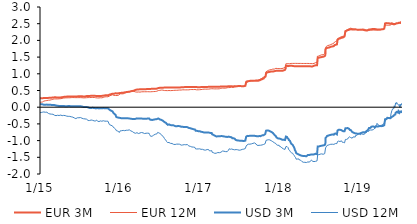
| Category | EUR 3M | EUR 12M | USD 3M | USD 12M |
|---|---|---|---|---|
| 2015-01-02 | 0.264 | 0.147 | 0.084 | -0.163 |
| 2015-01-05 | 0.265 | 0.149 | 0.086 | -0.164 |
| 2015-01-06 | 0.267 | 0.151 | 0.089 | -0.158 |
| 2015-01-07 | 0.27 | 0.151 | 0.088 | -0.157 |
| 2015-01-08 | 0.27 | 0.151 | 0.088 | -0.159 |
| 2015-01-09 | 0.27 | 0.152 | 0.086 | -0.156 |
| 2015-01-12 | 0.269 | 0.153 | 0.087 | -0.151 |
| 2015-01-13 | 0.259 | 0.152 | 0.077 | -0.152 |
| 2015-01-14 | 0.261 | 0.155 | 0.076 | -0.152 |
| 2015-01-15 | 0.261 | 0.157 | 0.077 | -0.145 |
| 2015-01-16 | 0.27 | 0.171 | 0.073 | -0.14 |
| 2015-01-19 | 0.274 | 0.181 | 0.074 | -0.142 |
| 2015-01-20 | 0.275 | 0.186 | 0.073 | -0.146 |
| 2015-01-21 | 0.275 | 0.187 | 0.073 | -0.152 |
| 2015-01-22 | 0.275 | 0.188 | 0.074 | -0.153 |
| 2015-01-23 | 0.275 | 0.188 | 0.074 | -0.153 |
| 2015-01-26 | 0.276 | 0.193 | 0.074 | -0.151 |
| 2015-01-27 | 0.275 | 0.193 | 0.077 | -0.152 |
| 2015-01-28 | 0.277 | 0.197 | 0.075 | -0.148 |
| 2015-01-29 | 0.278 | 0.199 | 0.075 | -0.15 |
| 2015-01-30 | 0.276 | 0.2 | 0.077 | -0.151 |
| 2015-02-02 | 0.275 | 0.199 | 0.078 | -0.149 |
| 2015-02-03 | 0.275 | 0.204 | 0.075 | -0.148 |
| 2015-02-04 | 0.275 | 0.207 | 0.075 | -0.155 |
| 2015-02-05 | 0.279 | 0.208 | 0.074 | -0.159 |
| 2015-02-06 | 0.277 | 0.209 | 0.074 | -0.161 |
| 2015-02-09 | 0.279 | 0.209 | 0.072 | -0.186 |
| 2015-02-10 | 0.28 | 0.208 | 0.072 | -0.194 |
| 2015-02-11 | 0.281 | 0.21 | 0.072 | -0.195 |
| 2015-02-12 | 0.282 | 0.21 | 0.072 | -0.202 |
| 2015-02-13 | 0.282 | 0.211 | 0.073 | -0.204 |
| 2015-02-16 | 0.282 | 0.212 | 0.074 | -0.203 |
| 2015-02-17 | 0.283 | 0.212 | 0.073 | -0.205 |
| 2015-02-18 | 0.282 | 0.215 | 0.069 | -0.214 |
| 2015-02-19 | 0.282 | 0.218 | 0.068 | -0.201 |
| 2015-02-20 | 0.282 | 0.22 | 0.067 | -0.204 |
| 2015-02-23 | 0.285 | 0.224 | 0.068 | -0.208 |
| 2015-02-24 | 0.286 | 0.225 | 0.069 | -0.207 |
| 2015-02-25 | 0.288 | 0.219 | 0.069 | -0.209 |
| 2015-02-26 | 0.29 | 0.222 | 0.068 | -0.209 |
| 2015-02-27 | 0.291 | 0.227 | 0.068 | -0.22 |
| 2015-03-02 | 0.291 | 0.24 | 0.069 | -0.212 |
| 2015-03-03 | 0.292 | 0.242 | 0.065 | -0.217 |
| 2015-03-04 | 0.292 | 0.243 | 0.066 | -0.219 |
| 2015-03-05 | 0.294 | 0.244 | 0.066 | -0.219 |
| 2015-03-06 | 0.294 | 0.245 | 0.065 | -0.218 |
| 2015-03-09 | 0.295 | 0.248 | 0.063 | -0.241 |
| 2015-03-10 | 0.298 | 0.251 | 0.062 | -0.241 |
| 2015-03-11 | 0.301 | 0.243 | 0.06 | -0.255 |
| 2015-03-12 | 0.303 | 0.245 | 0.059 | -0.254 |
| 2015-03-13 | 0.305 | 0.246 | 0.059 | -0.253 |
| 2015-03-16 | 0.295 | 0.248 | 0.05 | -0.253 |
| 2015-03-17 | 0.295 | 0.251 | 0.051 | -0.253 |
| 2015-03-18 | 0.285 | 0.238 | 0.04 | -0.265 |
| 2015-03-19 | 0.286 | 0.241 | 0.045 | -0.237 |
| 2015-03-20 | 0.289 | 0.245 | 0.043 | -0.247 |
| 2015-03-23 | 0.288 | 0.247 | 0.043 | -0.241 |
| 2015-03-24 | 0.289 | 0.248 | 0.041 | -0.242 |
| 2015-03-25 | 0.289 | 0.249 | 0.041 | -0.247 |
| 2015-03-26 | 0.289 | 0.249 | 0.037 | -0.25 |
| 2015-03-27 | 0.289 | 0.251 | 0.035 | -0.252 |
| 2015-03-30 | 0.292 | 0.252 | 0.036 | -0.249 |
| 2015-03-31 | 0.291 | 0.252 | 0.039 | -0.244 |
| 2015-04-01 | 0.292 | 0.254 | 0.039 | -0.248 |
| 2015-04-02 | 0.292 | 0.255 | 0.036 | -0.242 |
| 2015-04-03 | 0.292 | 0.255 | 0.036 | -0.242 |
| 2015-04-07 | 0.294 | 0.255 | 0.036 | -0.236 |
| 2015-04-08 | 0.296 | 0.259 | 0.039 | -0.239 |
| 2015-04-09 | 0.298 | 0.26 | 0.034 | -0.244 |
| 2015-04-10 | 0.298 | 0.262 | 0.033 | -0.248 |
| 2015-04-13 | 0.299 | 0.263 | 0.035 | -0.253 |
| 2015-04-14 | 0.302 | 0.267 | 0.034 | -0.25 |
| 2015-04-15 | 0.306 | 0.27 | 0.036 | -0.243 |
| 2015-04-16 | 0.308 | 0.272 | 0.035 | -0.241 |
| 2015-04-17 | 0.309 | 0.273 | 0.034 | -0.235 |
| 2015-04-20 | 0.309 | 0.274 | 0.034 | -0.245 |
| 2015-04-21 | 0.311 | 0.264 | 0.033 | -0.261 |
| 2015-04-22 | 0.312 | 0.275 | 0.032 | -0.249 |
| 2015-04-23 | 0.312 | 0.277 | 0.033 | -0.256 |
| 2015-04-24 | 0.311 | 0.278 | 0.033 | -0.256 |
| 2015-04-27 | 0.312 | 0.279 | 0.031 | -0.251 |
| 2015-04-28 | 0.315 | 0.282 | 0.032 | -0.246 |
| 2015-04-29 | 0.315 | 0.283 | 0.032 | -0.249 |
| 2015-04-30 | 0.315 | 0.279 | 0.031 | -0.255 |
| 2015-05-04 | 0.317 | 0.28 | 0.03 | -0.268 |
| 2015-05-05 | 0.318 | 0.283 | 0.03 | -0.268 |
| 2015-05-06 | 0.318 | 0.281 | 0.034 | -0.284 |
| 2015-05-07 | 0.319 | 0.281 | 0.031 | -0.286 |
| 2015-05-11 | 0.319 | 0.282 | 0.033 | -0.274 |
| 2015-05-12 | 0.319 | 0.281 | 0.035 | -0.285 |
| 2015-05-13 | 0.319 | 0.281 | 0.036 | -0.28 |
| 2015-05-14 | 0.319 | 0.282 | 0.034 | -0.273 |
| 2015-05-15 | 0.32 | 0.283 | 0.033 | -0.273 |
| 2015-05-18 | 0.321 | 0.282 | 0.034 | -0.275 |
| 2015-05-19 | 0.322 | 0.286 | 0.029 | -0.278 |
| 2015-05-20 | 0.322 | 0.288 | 0.027 | -0.289 |
| 2015-05-21 | 0.322 | 0.288 | 0.028 | -0.289 |
| 2015-05-22 | 0.322 | 0.288 | 0.026 | -0.288 |
| 2015-05-25 | 0.322 | 0.287 | 0.026 | -0.288 |
| 2015-05-26 | 0.323 | 0.289 | 0.024 | -0.307 |
| 2015-05-27 | 0.323 | 0.29 | 0.027 | -0.303 |
| 2015-05-28 | 0.323 | 0.291 | 0.027 | -0.303 |
| 2015-05-29 | 0.322 | 0.29 | 0.026 | -0.3 |
| 2015-06-01 | 0.323 | 0.289 | 0.028 | -0.298 |
| 2015-06-02 | 0.323 | 0.292 | 0.031 | -0.3 |
| 2015-06-03 | 0.324 | 0.29 | 0.031 | -0.295 |
| 2015-06-04 | 0.323 | 0.298 | 0.031 | -0.288 |
| 2015-06-05 | 0.323 | 0.299 | 0.029 | -0.289 |
| 2015-06-08 | 0.323 | 0.287 | 0.028 | -0.322 |
| 2015-06-09 | 0.323 | 0.297 | 0.025 | -0.308 |
| 2015-06-10 | 0.324 | 0.284 | 0.022 | -0.332 |
| 2015-06-11 | 0.324 | 0.289 | 0.024 | -0.338 |
| 2015-06-12 | 0.324 | 0.287 | 0.024 | -0.341 |
| 2015-06-15 | 0.324 | 0.286 | 0.027 | -0.342 |
| 2015-06-16 | 0.324 | 0.284 | 0.024 | -0.34 |
| 2015-06-17 | 0.324 | 0.284 | 0.024 | -0.341 |
| 2015-06-18 | 0.324 | 0.284 | 0.029 | -0.316 |
| 2015-06-19 | 0.324 | 0.284 | 0.029 | -0.317 |
| 2015-06-22 | 0.324 | 0.286 | 0.028 | -0.316 |
| 2015-06-23 | 0.324 | 0.287 | 0.029 | -0.319 |
| 2015-06-24 | 0.324 | 0.287 | 0.029 | -0.326 |
| 2015-06-25 | 0.325 | 0.288 | 0.028 | -0.324 |
| 2015-06-26 | 0.325 | 0.288 | 0.028 | -0.326 |
| 2015-06-29 | 0.326 | 0.287 | 0.026 | -0.316 |
| 2015-06-30 | 0.324 | 0.286 | 0.027 | -0.321 |
| 2015-07-01 | 0.324 | 0.286 | 0.026 | -0.328 |
| 2015-07-02 | 0.325 | 0.287 | 0.027 | -0.337 |
| 2015-07-03 | 0.325 | 0.287 | 0.026 | -0.322 |
| 2015-07-07 | 0.328 | 0.286 | 0.027 | -0.31 |
| 2015-07-08 | 0.328 | 0.286 | 0.027 | -0.3 |
| 2015-07-09 | 0.328 | 0.287 | 0.024 | -0.303 |
| 2015-07-10 | 0.328 | 0.286 | 0.024 | -0.313 |
| 2015-07-13 | 0.329 | 0.284 | 0.021 | -0.331 |
| 2015-07-14 | 0.329 | 0.282 | 0.022 | -0.329 |
| 2015-07-15 | 0.319 | 0.281 | 0.012 | -0.323 |
| 2015-07-16 | 0.319 | 0.281 | 0.013 | -0.323 |
| 2015-07-17 | 0.319 | 0.28 | 0.008 | -0.326 |
| 2015-07-20 | 0.319 | 0.279 | 0.005 | -0.345 |
| 2015-07-21 | 0.319 | 0.28 | 0.006 | -0.355 |
| 2015-07-22 | 0.329 | 0.279 | 0.018 | -0.355 |
| 2015-07-23 | 0.329 | 0.279 | 0.015 | -0.357 |
| 2015-07-24 | 0.319 | 0.28 | 0.006 | -0.357 |
| 2015-07-27 | 0.32 | 0.281 | 0.006 | -0.351 |
| 2015-07-28 | 0.321 | 0.281 | 0.003 | -0.354 |
| 2015-07-29 | 0.322 | 0.281 | 0.003 | -0.351 |
| 2015-07-30 | 0.323 | 0.281 | 0 | -0.364 |
| 2015-07-31 | 0.333 | 0.283 | 0.001 | -0.378 |
| 2015-08-03 | 0.333 | 0.284 | 0.006 | -0.359 |
| 2015-08-04 | 0.333 | 0.286 | 0.009 | -0.355 |
| 2015-08-05 | 0.334 | 0.287 | -0.001 | -0.382 |
| 2015-08-06 | 0.334 | 0.287 | -0.001 | -0.385 |
| 2015-08-07 | 0.334 | 0.287 | -0.002 | -0.386 |
| 2015-08-10 | 0.334 | 0.288 | -0.004 | -0.397 |
| 2015-08-11 | 0.334 | 0.288 | -0.004 | -0.389 |
| 2015-08-12 | 0.334 | 0.289 | 0.001 | -0.372 |
| 2015-08-13 | 0.334 | 0.289 | -0.011 | -0.385 |
| 2015-08-14 | 0.335 | 0.289 | -0.014 | -0.394 |
| 2015-08-17 | 0.337 | 0.289 | -0.023 | -0.399 |
| 2015-08-18 | 0.338 | 0.291 | -0.023 | -0.394 |
| 2015-08-19 | 0.339 | 0.29 | -0.023 | -0.4 |
| 2015-08-20 | 0.34 | 0.291 | -0.019 | -0.408 |
| 2015-08-21 | 0.341 | 0.29 | -0.019 | -0.398 |
| 2015-08-24 | 0.342 | 0.29 | -0.022 | -0.383 |
| 2015-08-25 | 0.343 | 0.289 | -0.017 | -0.377 |
| 2015-08-26 | 0.343 | 0.29 | -0.015 | -0.381 |
| 2015-08-27 | 0.343 | 0.29 | -0.014 | -0.392 |
| 2015-08-28 | 0.343 | 0.289 | -0.019 | -0.393 |
| 2015-08-31 | 0.343 | 0.29 | -0.019 | -0.393 |
| 2015-09-01 | 0.343 | 0.289 | -0.024 | -0.406 |
| 2015-09-02 | 0.343 | 0.29 | -0.023 | -0.404 |
| 2015-09-03 | 0.343 | 0.289 | -0.024 | -0.404 |
| 2015-09-04 | 0.344 | 0.292 | -0.022 | -0.4 |
| 2015-09-07 | 0.344 | 0.292 | -0.023 | -0.41 |
| 2015-09-08 | 0.335 | 0.282 | -0.032 | -0.417 |
| 2015-09-09 | 0.335 | 0.282 | -0.033 | -0.415 |
| 2015-09-10 | 0.336 | 0.283 | -0.036 | -0.415 |
| 2015-09-11 | 0.338 | 0.283 | -0.037 | -0.416 |
| 2015-09-14 | 0.338 | 0.283 | -0.036 | -0.415 |
| 2015-09-15 | 0.336 | 0.285 | -0.034 | -0.415 |
| 2015-09-16 | 0.347 | 0.284 | -0.03 | -0.427 |
| 2015-09-17 | 0.347 | 0.284 | -0.035 | -0.431 |
| 2015-09-18 | 0.347 | 0.286 | -0.009 | -0.385 |
| 2015-09-21 | 0.338 | 0.278 | -0.026 | -0.409 |
| 2015-09-22 | 0.339 | 0.28 | -0.027 | -0.412 |
| 2015-09-23 | 0.339 | 0.283 | -0.026 | -0.416 |
| 2015-09-24 | 0.34 | 0.282 | -0.026 | -0.417 |
| 2015-09-25 | 0.331 | 0.274 | -0.036 | -0.441 |
| 2015-09-29 | 0.331 | 0.277 | -0.036 | -0.432 |
| 2015-09-30 | 0.33 | 0.278 | -0.035 | -0.431 |
| 2015-10-01 | 0.333 | 0.28 | -0.034 | -0.427 |
| 2015-10-02 | 0.334 | 0.281 | -0.037 | -0.432 |
| 2015-10-05 | 0.336 | 0.283 | -0.033 | -0.411 |
| 2015-10-06 | 0.336 | 0.281 | -0.028 | -0.416 |
| 2015-10-07 | 0.336 | 0.28 | -0.029 | -0.42 |
| 2015-10-08 | 0.338 | 0.281 | -0.03 | -0.421 |
| 2015-10-09 | 0.339 | 0.281 | -0.031 | -0.425 |
| 2015-10-12 | 0.339 | 0.281 | -0.031 | -0.42 |
| 2015-10-13 | 0.339 | 0.281 | -0.031 | -0.415 |
| 2015-10-14 | 0.339 | 0.283 | -0.027 | -0.409 |
| 2015-10-15 | 0.342 | 0.286 | -0.025 | -0.396 |
| 2015-10-16 | 0.341 | 0.291 | -0.027 | -0.406 |
| 2015-10-19 | 0.344 | 0.292 | -0.027 | -0.406 |
| 2015-10-20 | 0.343 | 0.291 | -0.03 | -0.408 |
| 2015-10-21 | 0.343 | 0.29 | -0.026 | -0.411 |
| 2015-10-22 | 0.343 | 0.29 | -0.026 | -0.411 |
| 2015-10-23 | 0.343 | 0.29 | -0.026 | -0.411 |
| 2015-10-26 | 0.354 | 0.31 | -0.033 | -0.418 |
| 2015-10-27 | 0.356 | 0.312 | -0.034 | -0.418 |
| 2015-10-29 | 0.356 | 0.312 | -0.034 | -0.418 |
| 2015-10-30 | 0.356 | 0.312 | -0.034 | -0.418 |
| 2015-11-02 | 0.356 | 0.312 | -0.034 | -0.418 |
| 2015-11-03 | 0.356 | 0.312 | -0.034 | -0.418 |
| 2015-11-04 | 0.356 | 0.312 | -0.034 | -0.418 |
| 2015-11-05 | 0.356 | 0.312 | -0.034 | -0.418 |
| 2015-11-06 | 0.356 | 0.312 | -0.034 | -0.418 |
| 2015-11-09 | 0.356 | 0.312 | -0.034 | -0.418 |
| 2015-11-10 | 0.356 | 0.312 | -0.034 | -0.418 |
| 2015-11-11 | 0.356 | 0.312 | -0.034 | -0.418 |
| 2015-11-12 | 0.356 | 0.312 | -0.034 | -0.418 |
| 2015-11-13 | 0.356 | 0.302 | -0.034 | -0.428 |
| 2015-11-16 | 0.376 | 0.333 | -0.074 | -0.522 |
| 2015-11-18 | 0.382 | 0.334 | -0.08 | -0.526 |
| 2015-11-19 | 0.382 | 0.336 | -0.088 | -0.531 |
| 2015-11-20 | 0.385 | 0.352 | -0.092 | -0.527 |
| 2015-11-23 | 0.389 | 0.358 | -0.103 | -0.541 |
| 2015-11-24 | 0.394 | 0.362 | -0.112 | -0.547 |
| 2015-11-25 | 0.394 | 0.35 | -0.117 | -0.563 |
| 2015-11-26 | 0.399 | 0.367 | -0.122 | -0.558 |
| 2015-11-27 | 0.403 | 0.372 | -0.124 | -0.554 |
| 2015-11-30 | 0.404 | 0.372 | -0.126 | -0.561 |
| 2015-12-01 | 0.406 | 0.375 | -0.132 | -0.564 |
| 2015-12-02 | 0.408 | 0.377 | -0.146 | -0.57 |
| 2015-12-03 | 0.414 | 0.381 | -0.162 | -0.591 |
| 2015-12-04 | 0.403 | 0.352 | -0.172 | -0.598 |
| 2015-12-07 | 0.403 | 0.354 | -0.187 | -0.62 |
| 2015-12-08 | 0.406 | 0.353 | -0.196 | -0.625 |
| 2015-12-09 | 0.409 | 0.354 | -0.202 | -0.632 |
| 2015-12-10 | 0.415 | 0.356 | -0.212 | -0.635 |
| 2015-12-11 | 0.418 | 0.357 | -0.222 | -0.647 |
| 2015-12-14 | 0.419 | 0.35 | -0.228 | -0.654 |
| 2015-12-15 | 0.422 | 0.35 | -0.236 | -0.664 |
| 2015-12-16 | 0.423 | 0.351 | -0.242 | -0.674 |
| 2015-12-17 | 0.413 | 0.351 | -0.29 | -0.699 |
| 2015-12-18 | 0.411 | 0.352 | -0.306 | -0.704 |
| 2015-12-21 | 0.41 | 0.349 | -0.313 | -0.716 |
| 2015-12-22 | 0.421 | 0.36 | -0.304 | -0.711 |
| 2015-12-23 | 0.421 | 0.359 | -0.313 | -0.724 |
| 2015-12-28 | 0.421 | 0.36 | -0.313 | -0.728 |
| 2015-12-29 | 0.422 | 0.362 | -0.317 | -0.74 |
| 2015-12-30 | 0.422 | 0.361 | -0.322 | -0.755 |
| 2015-12-31 | 0.421 | 0.36 | -0.323 | -0.758 |
| 2016-01-04 | 0.422 | 0.402 | -0.322 | -0.709 |
| 2016-01-05 | 0.423 | 0.401 | -0.327 | -0.713 |
| 2016-01-06 | 0.426 | 0.404 | -0.33 | -0.705 |
| 2016-01-07 | 0.432 | 0.409 | -0.327 | -0.687 |
| 2016-01-08 | 0.433 | 0.409 | -0.331 | -0.695 |
| 2016-01-11 | 0.433 | 0.4 | -0.332 | -0.704 |
| 2016-01-12 | 0.434 | 0.402 | -0.334 | -0.706 |
| 2016-01-13 | 0.434 | 0.401 | -0.332 | -0.713 |
| 2016-01-14 | 0.433 | 0.402 | -0.331 | -0.709 |
| 2016-01-15 | 0.432 | 0.401 | -0.33 | -0.695 |
| 2016-01-18 | 0.432 | 0.401 | -0.33 | -0.695 |
| 2016-01-19 | 0.432 | 0.401 | -0.33 | -0.695 |
| 2016-01-20 | 0.432 | 0.401 | -0.33 | -0.695 |
| 2016-01-21 | 0.432 | 0.401 | -0.33 | -0.695 |
| 2016-01-22 | 0.432 | 0.401 | -0.33 | -0.695 |
| 2016-01-25 | 0.445 | 0.422 | -0.331 | -0.703 |
| 2016-01-26 | 0.448 | 0.425 | -0.331 | -0.701 |
| 2016-01-27 | 0.449 | 0.428 | -0.328 | -0.7 |
| 2016-01-28 | 0.45 | 0.428 | -0.326 | -0.701 |
| 2016-01-29 | 0.452 | 0.435 | -0.323 | -0.69 |
| 2016-02-01 | 0.452 | 0.44 | -0.329 | -0.69 |
| 2016-02-02 | 0.451 | 0.441 | -0.329 | -0.688 |
| 2016-02-03 | 0.452 | 0.442 | -0.331 | -0.68 |
| 2016-02-04 | 0.456 | 0.448 | -0.33 | -0.679 |
| 2016-02-05 | 0.457 | 0.452 | -0.33 | -0.686 |
| 2016-02-08 | 0.459 | 0.455 | -0.331 | -0.69 |
| 2016-02-09 | 0.451 | 0.454 | -0.34 | -0.681 |
| 2016-02-10 | 0.455 | 0.451 | -0.338 | -0.684 |
| 2016-02-11 | 0.459 | 0.456 | -0.337 | -0.667 |
| 2016-02-12 | 0.463 | 0.459 | -0.338 | -0.666 |
| 2016-02-15 | 0.463 | 0.458 | -0.338 | -0.678 |
| 2016-02-16 | 0.467 | 0.462 | -0.338 | -0.682 |
| 2016-02-17 | 0.469 | 0.461 | -0.339 | -0.685 |
| 2016-02-18 | 0.475 | 0.464 | -0.338 | -0.692 |
| 2016-02-19 | 0.478 | 0.467 | -0.338 | -0.69 |
| 2016-02-22 | 0.479 | 0.468 | -0.345 | -0.709 |
| 2016-02-23 | 0.48 | 0.466 | -0.349 | -0.707 |
| 2016-02-24 | 0.481 | 0.465 | -0.355 | -0.705 |
| 2016-02-25 | 0.481 | 0.465 | -0.356 | -0.71 |
| 2016-02-26 | 0.482 | 0.467 | -0.355 | -0.711 |
| 2016-02-29 | 0.485 | 0.474 | -0.353 | -0.729 |
| 2016-03-01 | 0.487 | 0.476 | -0.352 | -0.729 |
| 2016-03-02 | 0.488 | 0.474 | -0.355 | -0.746 |
| 2016-03-03 | 0.493 | 0.475 | -0.356 | -0.75 |
| 2016-03-04 | 0.495 | 0.478 | -0.353 | -0.744 |
| 2016-03-07 | 0.496 | 0.474 | -0.356 | -0.762 |
| 2016-03-08 | 0.501 | 0.475 | -0.355 | -0.757 |
| 2016-03-09 | 0.504 | 0.473 | -0.355 | -0.759 |
| 2016-03-10 | 0.509 | 0.475 | -0.352 | -0.761 |
| 2016-03-11 | 0.515 | 0.459 | -0.344 | -0.774 |
| 2016-03-14 | 0.516 | 0.458 | -0.35 | -0.781 |
| 2016-03-15 | 0.517 | 0.456 | -0.352 | -0.787 |
| 2016-03-16 | 0.52 | 0.454 | -0.349 | -0.795 |
| 2016-03-17 | 0.524 | 0.453 | -0.333 | -0.752 |
| 2016-03-18 | 0.525 | 0.453 | -0.334 | -0.761 |
| 2016-03-21 | 0.528 | 0.452 | -0.335 | -0.764 |
| 2016-03-22 | 0.529 | 0.452 | -0.338 | -0.774 |
| 2016-03-23 | 0.531 | 0.453 | -0.34 | -0.787 |
| 2016-03-24 | 0.532 | 0.455 | -0.339 | -0.781 |
| 2016-03-29 | 0.532 | 0.456 | -0.341 | -0.789 |
| 2016-03-30 | 0.533 | 0.454 | -0.335 | -0.764 |
| 2016-03-31 | 0.534 | 0.455 | -0.339 | -0.76 |
| 2016-04-01 | 0.535 | 0.452 | -0.339 | -0.763 |
| 2016-04-04 | 0.536 | 0.451 | -0.34 | -0.772 |
| 2016-04-05 | 0.538 | 0.454 | -0.337 | -0.755 |
| 2016-04-06 | 0.538 | 0.455 | -0.341 | -0.762 |
| 2016-04-07 | 0.537 | 0.457 | -0.339 | -0.756 |
| 2016-04-08 | 0.538 | 0.46 | -0.341 | -0.755 |
| 2016-04-11 | 0.541 | 0.461 | -0.34 | -0.758 |
| 2016-04-12 | 0.539 | 0.462 | -0.34 | -0.759 |
| 2016-04-13 | 0.539 | 0.463 | -0.338 | -0.768 |
| 2016-04-14 | 0.541 | 0.461 | -0.343 | -0.771 |
| 2016-04-15 | 0.539 | 0.461 | -0.343 | -0.771 |
| 2016-04-18 | 0.539 | 0.462 | -0.344 | -0.768 |
| 2016-04-19 | 0.54 | 0.461 | -0.345 | -0.775 |
| 2016-04-20 | 0.54 | 0.461 | -0.345 | -0.775 |
| 2016-04-21 | 0.54 | 0.461 | -0.345 | -0.775 |
| 2016-04-22 | 0.54 | 0.461 | -0.345 | -0.775 |
| 2016-04-25 | 0.54 | 0.463 | -0.344 | -0.789 |
| 2016-04-26 | 0.542 | 0.464 | -0.344 | -0.793 |
| 2016-04-27 | 0.541 | 0.461 | -0.348 | -0.794 |
| 2016-04-28 | 0.542 | 0.462 | -0.347 | -0.78 |
| 2016-04-29 | 0.541 | 0.462 | -0.347 | -0.78 |
| 2016-05-02 | 0.54 | 0.462 | -0.347 | -0.78 |
| 2016-05-03 | 0.541 | 0.462 | -0.343 | -0.782 |
| 2016-05-04 | 0.543 | 0.462 | -0.344 | -0.78 |
| 2016-05-05 | 0.545 | 0.463 | -0.342 | -0.78 |
| 2016-05-06 | 0.546 | 0.463 | -0.34 | -0.774 |
| 2016-05-09 | 0.548 | 0.464 | -0.34 | -0.777 |
| 2016-05-10 | 0.55 | 0.463 | -0.338 | -0.774 |
| 2016-05-11 | 0.549 | 0.462 | -0.337 | -0.775 |
| 2016-05-12 | 0.548 | 0.462 | -0.336 | -0.777 |
| 2016-05-13 | 0.547 | 0.462 | -0.338 | -0.779 |
| 2016-05-16 | 0.547 | 0.462 | -0.336 | -0.783 |
| 2016-05-17 | 0.547 | 0.461 | -0.335 | -0.792 |
| 2016-05-18 | 0.547 | 0.461 | -0.346 | -0.82 |
| 2016-05-19 | 0.548 | 0.461 | -0.364 | -0.848 |
| 2016-05-20 | 0.548 | 0.461 | -0.371 | -0.852 |
| 2016-05-23 | 0.548 | 0.462 | -0.372 | -0.853 |
| 2016-05-24 | 0.548 | 0.462 | -0.375 | -0.862 |
| 2016-05-25 | 0.548 | 0.463 | -0.377 | -0.873 |
| 2016-05-26 | 0.548 | 0.464 | -0.384 | -0.871 |
| 2016-05-27 | 0.55 | 0.465 | -0.383 | -0.867 |
| 2016-05-30 | 0.551 | 0.465 | -0.383 | -0.867 |
| 2016-05-31 | 0.551 | 0.465 | -0.396 | -0.887 |
| 2016-06-01 | 0.551 | 0.468 | -0.391 | -0.878 |
| 2016-06-02 | 0.552 | 0.467 | -0.39 | -0.882 |
| 2016-06-03 | 0.551 | 0.466 | -0.392 | -0.881 |
| 2016-06-06 | 0.552 | 0.468 | -0.371 | -0.836 |
| 2016-06-07 | 0.551 | 0.468 | -0.367 | -0.835 |
| 2016-06-08 | 0.554 | 0.468 | -0.368 | -0.828 |
| 2016-06-09 | 0.552 | 0.468 | -0.366 | -0.824 |
| 2016-06-10 | 0.553 | 0.468 | -0.366 | -0.824 |
| 2016-06-13 | 0.553 | 0.47 | -0.362 | -0.809 |
| 2016-06-14 | 0.552 | 0.471 | -0.365 | -0.803 |
| 2016-06-15 | 0.552 | 0.471 | -0.366 | -0.815 |
| 2016-06-16 | 0.554 | 0.476 | -0.357 | -0.788 |
| 2016-06-17 | 0.555 | 0.476 | -0.354 | -0.791 |
| 2016-06-20 | 0.556 | 0.478 | -0.356 | -0.802 |
| 2016-06-21 | 0.556 | 0.479 | -0.352 | -0.802 |
| 2016-06-22 | 0.558 | 0.479 | -0.35 | -0.801 |
| 2016-06-23 | 0.559 | 0.479 | -0.35 | -0.8 |
| 2016-06-24 | 0.571 | 0.497 | -0.334 | -0.755 |
| 2016-06-27 | 0.573 | 0.498 | -0.337 | -0.746 |
| 2016-06-28 | 0.571 | 0.499 | -0.341 | -0.755 |
| 2016-06-29 | 0.572 | 0.501 | -0.356 | -0.766 |
| 2016-06-30 | 0.576 | 0.501 | -0.364 | -0.78 |
| 2016-07-01 | 0.58 | 0.502 | -0.363 | -0.775 |
| 2016-07-04 | 0.581 | 0.505 | -0.366 | -0.785 |
| 2016-07-07 | 0.583 | 0.513 | -0.375 | -0.796 |
| 2016-07-08 | 0.583 | 0.509 | -0.377 | -0.803 |
| 2016-07-11 | 0.582 | 0.513 | -0.379 | -0.82 |
| 2016-07-12 | 0.581 | 0.511 | -0.383 | -0.834 |
| 2016-07-13 | 0.585 | 0.511 | -0.39 | -0.843 |
| 2016-07-14 | 0.585 | 0.511 | -0.389 | -0.848 |
| 2016-07-15 | 0.583 | 0.507 | -0.398 | -0.858 |
| 2016-07-18 | 0.585 | 0.511 | -0.406 | -0.876 |
| 2016-07-19 | 0.585 | 0.509 | -0.407 | -0.879 |
| 2016-07-20 | 0.585 | 0.509 | -0.407 | -0.879 |
| 2016-07-21 | 0.585 | 0.509 | -0.407 | -0.879 |
| 2016-07-22 | 0.585 | 0.509 | -0.407 | -0.879 |
| 2016-07-25 | 0.587 | 0.499 | -0.444 | -0.936 |
| 2016-07-26 | 0.588 | 0.498 | -0.453 | -0.949 |
| 2016-07-27 | 0.588 | 0.499 | -0.461 | -0.964 |
| 2016-07-28 | 0.586 | 0.499 | -0.466 | -0.97 |
| 2016-07-29 | 0.587 | 0.499 | -0.469 | -0.982 |
| 2016-08-01 | 0.587 | 0.498 | -0.469 | -0.984 |
| 2016-08-02 | 0.588 | 0.498 | -0.478 | -0.993 |
| 2016-08-03 | 0.589 | 0.497 | -0.488 | -1.005 |
| 2016-08-04 | 0.588 | 0.495 | -0.498 | -1.027 |
| 2016-08-05 | 0.588 | 0.497 | -0.502 | -1.025 |
| 2016-08-08 | 0.588 | 0.496 | -0.516 | -1.058 |
| 2016-08-09 | 0.588 | 0.497 | -0.526 | -1.072 |
| 2016-08-10 | 0.587 | 0.498 | -0.528 | -1.074 |
| 2016-08-11 | 0.589 | 0.499 | -0.527 | -1.07 |
| 2016-08-12 | 0.589 | 0.499 | -0.528 | -1.076 |
| 2016-08-15 | 0.588 | 0.5 | -0.514 | -1.057 |
| 2016-08-16 | 0.589 | 0.5 | -0.511 | -1.048 |
| 2016-08-17 | 0.588 | 0.499 | -0.521 | -1.07 |
| 2016-08-18 | 0.589 | 0.498 | -0.521 | -1.065 |
| 2016-08-19 | 0.588 | 0.497 | -0.527 | -1.073 |
| 2016-08-22 | 0.589 | 0.496 | -0.535 | -1.083 |
| 2016-08-23 | 0.588 | 0.497 | -0.535 | -1.081 |
| 2016-08-24 | 0.588 | 0.498 | -0.535 | -1.077 |
| 2016-08-25 | 0.588 | 0.499 | -0.539 | -1.076 |
| 2016-08-26 | 0.588 | 0.5 | -0.543 | -1.087 |
| 2016-08-29 | 0.587 | 0.5 | -0.543 | -1.087 |
| 2016-08-30 | 0.589 | 0.501 | -0.552 | -1.109 |
| 2016-08-31 | 0.589 | 0.502 | -0.549 | -1.107 |
| 2016-09-01 | 0.589 | 0.501 | -0.546 | -1.116 |
| 2016-09-02 | 0.591 | 0.502 | -0.545 | -1.109 |
| 2016-09-05 | 0.591 | 0.502 | -0.543 | -1.112 |
| 2016-09-06 | 0.593 | 0.504 | -0.551 | -1.111 |
| 2016-09-07 | 0.593 | 0.509 | -0.544 | -1.089 |
| 2016-09-08 | 0.594 | 0.51 | -0.555 | -1.09 |
| 2016-09-09 | 0.591 | 0.507 | -0.562 | -1.107 |
| 2016-09-12 | 0.593 | 0.507 | -0.566 | -1.116 |
| 2016-09-13 | 0.592 | 0.505 | -0.56 | -1.104 |
| 2016-09-14 | 0.593 | 0.504 | -0.564 | -1.106 |
| 2016-09-15 | 0.591 | 0.503 | -0.567 | -1.1 |
| 2016-09-16 | 0.591 | 0.504 | -0.567 | -1.095 |
| 2016-09-19 | 0.591 | 0.506 | -0.571 | -1.106 |
| 2016-09-20 | 0.591 | 0.507 | -0.576 | -1.115 |
| 2016-09-21 | 0.591 | 0.508 | -0.573 | -1.121 |
| 2016-09-22 | 0.591 | 0.509 | -0.567 | -1.111 |
| 2016-09-23 | 0.592 | 0.509 | -0.563 | -1.107 |
| 2016-09-26 | 0.593 | 0.51 | -0.563 | -1.105 |
| 2016-09-27 | 0.591 | 0.51 | -0.564 | -1.101 |
| 2016-09-29 | 0.591 | 0.514 | -0.556 | -1.106 |
| 2016-09-30 | 0.591 | 0.514 | -0.564 | -1.102 |
| 2016-10-03 | 0.591 | 0.514 | -0.568 | -1.109 |
| 2016-10-04 | 0.591 | 0.514 | -0.574 | -1.116 |
| 2016-10-05 | 0.592 | 0.514 | -0.578 | -1.123 |
| 2016-10-06 | 0.594 | 0.514 | -0.582 | -1.131 |
| 2016-10-07 | 0.594 | 0.513 | -0.586 | -1.137 |
| 2016-10-10 | 0.595 | 0.514 | -0.584 | -1.136 |
| 2016-10-11 | 0.596 | 0.516 | -0.587 | -1.141 |
| 2016-10-12 | 0.599 | 0.519 | -0.591 | -1.146 |
| 2016-10-13 | 0.601 | 0.521 | -0.59 | -1.137 |
| 2016-10-14 | 0.601 | 0.522 | -0.592 | -1.136 |
| 2016-10-17 | 0.601 | 0.521 | -0.588 | -1.131 |
| 2016-10-18 | 0.602 | 0.523 | -0.591 | -1.121 |
| 2016-10-19 | 0.603 | 0.523 | -0.591 | -1.114 |
| 2016-10-20 | 0.603 | 0.523 | -0.592 | -1.116 |
| 2016-10-21 | 0.602 | 0.524 | -0.592 | -1.122 |
| 2016-10-24 | 0.601 | 0.52 | -0.594 | -1.121 |
| 2016-10-25 | 0.602 | 0.521 | -0.596 | -1.128 |
| 2016-10-26 | 0.603 | 0.52 | -0.6 | -1.13 |
| 2016-10-27 | 0.602 | 0.52 | -0.597 | -1.132 |
| 2016-10-31 | 0.603 | 0.519 | -0.594 | -1.125 |
| 2016-11-01 | 0.603 | 0.519 | -0.591 | -1.126 |
| 2016-11-02 | 0.603 | 0.521 | -0.586 | -1.115 |
| 2016-11-03 | 0.603 | 0.521 | -0.591 | -1.11 |
| 2016-11-04 | 0.602 | 0.521 | -0.593 | -1.109 |
| 2016-11-07 | 0.602 | 0.52 | -0.597 | -1.118 |
| 2016-11-08 | 0.602 | 0.52 | -0.592 | -1.118 |
| 2016-11-09 | 0.602 | 0.52 | -0.596 | -1.106 |
| 2016-11-10 | 0.602 | 0.521 | -0.612 | -1.133 |
| 2016-11-11 | 0.602 | 0.519 | -0.616 | -1.138 |
| 2016-11-14 | 0.602 | 0.52 | -0.621 | -1.16 |
| 2016-11-15 | 0.602 | 0.521 | -0.616 | -1.155 |
| 2016-11-16 | 0.601 | 0.523 | -0.619 | -1.162 |
| 2016-11-18 | 0.603 | 0.527 | -0.626 | -1.171 |
| 2016-11-21 | 0.602 | 0.528 | -0.63 | -1.173 |
| 2016-11-22 | 0.603 | 0.529 | -0.635 | -1.178 |
| 2016-11-23 | 0.603 | 0.528 | -0.64 | -1.18 |
| 2016-11-24 | 0.604 | 0.529 | -0.647 | -1.193 |
| 2016-11-25 | 0.604 | 0.529 | -0.647 | -1.195 |
| 2016-11-28 | 0.604 | 0.529 | -0.645 | -1.191 |
| 2016-11-29 | 0.604 | 0.529 | -0.641 | -1.191 |
| 2016-11-30 | 0.604 | 0.53 | -0.644 | -1.189 |
| 2016-12-01 | 0.603 | 0.529 | -0.652 | -1.193 |
| 2016-12-02 | 0.603 | 0.526 | -0.656 | -1.195 |
| 2016-12-05 | 0.603 | 0.528 | -0.658 | -1.194 |
| 2016-12-06 | 0.605 | 0.529 | -0.661 | -1.196 |
| 2016-12-07 | 0.606 | 0.528 | -0.661 | -1.195 |
| 2016-12-08 | 0.608 | 0.528 | -0.663 | -1.195 |
| 2016-12-09 | 0.606 | 0.531 | -0.667 | -1.198 |
| 2016-12-12 | 0.606 | 0.531 | -0.669 | -1.205 |
| 2016-12-13 | 0.606 | 0.531 | -0.673 | -1.204 |
| 2016-12-14 | 0.606 | 0.532 | -0.68 | -1.205 |
| 2016-12-15 | 0.606 | 0.531 | -0.703 | -1.25 |
| 2016-12-16 | 0.604 | 0.531 | -0.707 | -1.243 |
| 2016-12-19 | 0.603 | 0.521 | -0.704 | -1.252 |
| 2016-12-20 | 0.603 | 0.521 | -0.706 | -1.251 |
| 2016-12-21 | 0.605 | 0.522 | -0.708 | -1.25 |
| 2016-12-22 | 0.596 | 0.522 | -0.717 | -1.248 |
| 2016-12-23 | 0.597 | 0.522 | -0.717 | -1.25 |
| 2016-12-27 | 0.598 | 0.521 | -0.717 | -1.25 |
| 2016-12-28 | 0.589 | 0.512 | -0.728 | -1.26 |
| 2016-12-29 | 0.599 | 0.521 | -0.718 | -1.247 |
| 2016-12-30 | 0.599 | 0.522 | -0.718 | -1.246 |
| 2017-01-02 | 0.598 | 0.523 | -0.718 | -1.246 |
| 2017-01-03 | 0.599 | 0.524 | -0.719 | -1.249 |
| 2017-01-04 | 0.6 | 0.525 | -0.725 | -1.249 |
| 2017-01-05 | 0.601 | 0.525 | -0.729 | -1.249 |
| 2017-01-06 | 0.601 | 0.527 | -0.73 | -1.245 |
| 2017-01-09 | 0.602 | 0.528 | -0.735 | -1.261 |
| 2017-01-10 | 0.604 | 0.53 | -0.738 | -1.262 |
| 2017-01-11 | 0.606 | 0.531 | -0.742 | -1.263 |
| 2017-01-12 | 0.607 | 0.533 | -0.742 | -1.258 |
| 2017-01-13 | 0.607 | 0.534 | -0.743 | -1.258 |
| 2017-01-16 | 0.608 | 0.535 | -0.744 | -1.262 |
| 2017-01-17 | 0.609 | 0.538 | -0.745 | -1.262 |
| 2017-01-18 | 0.609 | 0.539 | -0.75 | -1.27 |
| 2017-01-19 | 0.609 | 0.54 | -0.761 | -1.288 |
| 2017-01-20 | 0.609 | 0.54 | -0.761 | -1.288 |
| 2017-01-23 | 0.607 | 0.541 | -0.758 | -1.281 |
| 2017-01-24 | 0.608 | 0.541 | -0.752 | -1.267 |
| 2017-01-25 | 0.608 | 0.541 | -0.757 | -1.279 |
| 2017-01-26 | 0.608 | 0.542 | -0.759 | -1.288 |
| 2017-01-27 | 0.608 | 0.541 | -0.759 | -1.284 |
| 2017-01-30 | 0.608 | 0.54 | -0.754 | -1.285 |
| 2017-01-31 | 0.607 | 0.541 | -0.755 | -1.273 |
| 2017-02-01 | 0.608 | 0.543 | -0.755 | -1.275 |
| 2017-02-02 | 0.608 | 0.542 | -0.754 | -1.272 |
| 2017-02-03 | 0.608 | 0.541 | -0.754 | -1.273 |
| 2017-02-06 | 0.608 | 0.541 | -0.758 | -1.267 |
| 2017-02-07 | 0.608 | 0.541 | -0.758 | -1.265 |
| 2017-02-08 | 0.608 | 0.541 | -0.754 | -1.26 |
| 2017-02-09 | 0.608 | 0.541 | -0.754 | -1.254 |
| 2017-02-10 | 0.609 | 0.541 | -0.756 | -1.263 |
| 2017-02-13 | 0.609 | 0.542 | -0.759 | -1.27 |
| 2017-02-14 | 0.608 | 0.544 | -0.757 | -1.268 |
| 2017-02-15 | 0.608 | 0.544 | -0.762 | -1.284 |
| 2017-02-16 | 0.608 | 0.546 | -0.776 | -1.305 |
| 2017-02-17 | 0.609 | 0.549 | -0.772 | -1.295 |
| 2017-02-20 | 0.609 | 0.549 | -0.77 | -1.295 |
| 2017-02-21 | 0.609 | 0.551 | -0.773 | -1.305 |
| 2017-02-22 | 0.61 | 0.551 | -0.774 | -1.306 |
| 2017-02-23 | 0.609 | 0.551 | -0.772 | -1.304 |
| 2017-02-24 | 0.609 | 0.553 | -0.774 | -1.3 |
| 2017-02-27 | 0.609 | 0.553 | -0.775 | -1.3 |
| 2017-02-28 | 0.61 | 0.554 | -0.784 | -1.316 |
| 2017-03-01 | 0.609 | 0.554 | -0.813 | -1.35 |
| 2017-03-02 | 0.609 | 0.554 | -0.82 | -1.358 |
| 2017-03-03 | 0.609 | 0.553 | -0.822 | -1.368 |
| 2017-03-06 | 0.609 | 0.551 | -0.826 | -1.36 |
| 2017-03-07 | 0.608 | 0.551 | -0.826 | -1.36 |
| 2017-03-08 | 0.609 | 0.551 | -0.829 | -1.361 |
| 2017-03-09 | 0.609 | 0.551 | -0.84 | -1.374 |
| 2017-03-10 | 0.609 | 0.549 | -0.841 | -1.378 |
| 2017-03-13 | 0.61 | 0.548 | -0.851 | -1.381 |
| 2017-03-14 | 0.61 | 0.548 | -0.857 | -1.383 |
| 2017-03-15 | 0.609 | 0.55 | -0.868 | -1.388 |
| 2017-03-16 | 0.609 | 0.551 | -0.872 | -1.374 |
| 2017-03-17 | 0.609 | 0.549 | -0.872 | -1.373 |
| 2017-03-20 | 0.609 | 0.549 | -0.876 | -1.376 |
| 2017-03-21 | 0.609 | 0.546 | -0.876 | -1.375 |
| 2017-03-22 | 0.61 | 0.546 | -0.877 | -1.367 |
| 2017-03-23 | 0.61 | 0.547 | -0.873 | -1.364 |
| 2017-03-24 | 0.61 | 0.547 | -0.871 | -1.363 |
| 2017-03-27 | 0.61 | 0.549 | -0.872 | -1.357 |
| 2017-03-28 | 0.61 | 0.55 | -0.872 | -1.358 |
| 2017-03-29 | 0.61 | 0.549 | -0.867 | -1.354 |
| 2017-03-30 | 0.61 | 0.549 | -0.868 | -1.353 |
| 2017-03-31 | 0.609 | 0.549 | -0.87 | -1.362 |
| 2017-04-03 | 0.61 | 0.551 | -0.87 | -1.363 |
| 2017-04-04 | 0.61 | 0.551 | -0.87 | -1.352 |
| 2017-04-05 | 0.609 | 0.554 | -0.87 | -1.356 |
| 2017-04-06 | 0.61 | 0.555 | -0.875 | -1.358 |
| 2017-04-07 | 0.62 | 0.556 | -0.868 | -1.359 |
| 2017-04-10 | 0.622 | 0.568 | -0.866 | -1.348 |
| 2017-04-11 | 0.622 | 0.569 | -0.865 | -1.339 |
| 2017-04-12 | 0.622 | 0.57 | -0.868 | -1.333 |
| 2017-04-13 | 0.621 | 0.57 | -0.868 | -1.322 |
| 2017-04-18 | 0.621 | 0.572 | -0.866 | -1.311 |
| 2017-04-19 | 0.622 | 0.573 | -0.866 | -1.286 |
| 2017-04-20 | 0.622 | 0.574 | -0.863 | -1.289 |
| 2017-04-21 | 0.621 | 0.574 | -0.866 | -1.295 |
| 2017-04-24 | 0.619 | 0.571 | -0.876 | -1.318 |
| 2017-04-25 | 0.619 | 0.571 | -0.88 | -1.325 |
| 2017-04-26 | 0.619 | 0.571 | -0.882 | -1.333 |
| 2017-04-27 | 0.619 | 0.571 | -0.88 | -1.326 |
| 2017-04-28 | 0.619 | 0.571 | -0.882 | -1.324 |
| 2017-05-02 | 0.619 | 0.571 | -0.884 | -1.33 |
| 2017-05-03 | 0.619 | 0.575 | -0.881 | -1.32 |
| 2017-05-04 | 0.619 | 0.576 | -0.889 | -1.331 |
| 2017-05-05 | 0.619 | 0.574 | -0.89 | -1.329 |
| 2017-05-09 | 0.619 | 0.583 | -0.892 | -1.331 |
| 2017-05-10 | 0.619 | 0.584 | -0.891 | -1.328 |
| 2017-05-11 | 0.629 | 0.584 | -0.882 | -1.326 |
| 2017-05-12 | 0.629 | 0.587 | -0.88 | -1.306 |
| 2017-05-15 | 0.63 | 0.587 | -0.879 | -1.285 |
| 2017-05-16 | 0.631 | 0.588 | -0.881 | -1.285 |
| 2017-05-17 | 0.631 | 0.589 | -0.878 | -1.273 |
| 2017-05-18 | 0.631 | 0.589 | -0.872 | -1.245 |
| 2017-05-19 | 0.631 | 0.589 | -0.886 | -1.263 |
| 2017-05-22 | 0.629 | 0.589 | -0.892 | -1.266 |
| 2017-05-23 | 0.63 | 0.589 | -0.889 | -1.26 |
| 2017-05-24 | 0.629 | 0.599 | -0.898 | -1.256 |
| 2017-05-25 | 0.629 | 0.599 | -0.9 | -1.253 |
| 2017-05-26 | 0.629 | 0.6 | -0.902 | -1.251 |
| 2017-05-29 | 0.629 | 0.601 | -0.902 | -1.251 |
| 2017-05-30 | 0.629 | 0.591 | -0.902 | -1.262 |
| 2017-05-31 | 0.629 | 0.591 | -0.91 | -1.264 |
| 2017-06-01 | 0.629 | 0.591 | -0.918 | -1.266 |
| 2017-06-02 | 0.619 | 0.591 | -0.932 | -1.271 |
| 2017-06-05 | 0.619 | 0.591 | -0.93 | -1.266 |
| 2017-06-06 | 0.619 | 0.593 | -0.929 | -1.263 |
| 2017-06-07 | 0.619 | 0.594 | -0.931 | -1.264 |
| 2017-06-08 | 0.62 | 0.594 | -0.938 | -1.268 |
| 2017-06-09 | 0.631 | 0.6 | -0.936 | -1.268 |
| 2017-06-12 | 0.631 | 0.607 | -0.942 | -1.276 |
| 2017-06-13 | 0.631 | 0.609 | -0.946 | -1.276 |
| 2017-06-14 | 0.631 | 0.612 | -0.95 | -1.276 |
| 2017-06-15 | 0.629 | 0.612 | -0.967 | -1.27 |
| 2017-06-16 | 0.629 | 0.614 | -0.974 | -1.272 |
| 2017-06-19 | 0.629 | 0.616 | -0.98 | -1.268 |
| 2017-06-20 | 0.629 | 0.619 | -0.987 | -1.276 |
| 2017-06-21 | 0.629 | 0.621 | -0.989 | -1.275 |
| 2017-06-22 | 0.63 | 0.621 | -0.996 | -1.278 |
| 2017-06-23 | 0.631 | 0.623 | -0.993 | -1.273 |
| 2017-06-26 | 0.631 | 0.621 | -0.995 | -1.275 |
| 2017-06-27 | 0.631 | 0.621 | -0.995 | -1.273 |
| 2017-06-28 | 0.631 | 0.618 | -0.996 | -1.277 |
| 2017-06-29 | 0.621 | 0.616 | -1.009 | -1.28 |
| 2017-06-30 | 0.631 | 0.616 | -0.999 | -1.278 |
| 2017-07-03 | 0.631 | 0.617 | -1.001 | -1.288 |
| 2017-07-04 | 0.629 | 0.619 | -1.002 | -1.291 |
| 2017-07-07 | 0.631 | 0.631 | -1.005 | -1.288 |
| 2017-07-10 | 0.631 | 0.626 | -1.004 | -1.281 |
| 2017-07-11 | 0.631 | 0.625 | -1.004 | -1.282 |
| 2017-07-12 | 0.631 | 0.624 | -1.004 | -1.276 |
| 2017-07-13 | 0.631 | 0.621 | -1.004 | -1.268 |
| 2017-07-14 | 0.631 | 0.621 | -1.004 | -1.27 |
| 2017-07-17 | 0.63 | 0.621 | -1.006 | -1.263 |
| 2017-07-18 | 0.631 | 0.621 | -1.007 | -1.263 |
| 2017-07-19 | 0.632 | 0.621 | -1.007 | -1.263 |
| 2017-07-20 | 0.632 | 0.621 | -1.007 | -1.263 |
| 2017-07-21 | 0.632 | 0.621 | -1.007 | -1.263 |
| 2017-07-24 | 0.629 | 0.633 | -1.014 | -1.256 |
| 2017-07-25 | 0.629 | 0.633 | -1.017 | -1.259 |
| 2017-07-26 | 0.63 | 0.633 | -1.014 | -1.256 |
| 2017-07-27 | 0.629 | 0.633 | -1.011 | -1.25 |
| 2017-07-28 | 0.639 | 0.632 | -1.001 | -1.249 |
| 2017-07-31 | 0.64 | 0.641 | -1.001 | -1.237 |
| 2017-08-01 | 0.641 | 0.641 | -1.001 | -1.236 |
| 2017-08-02 | 0.641 | 0.643 | -1.003 | -1.236 |
| 2017-08-03 | 0.639 | 0.642 | -1.002 | -1.236 |
| 2017-08-04 | 0.759 | 0.711 | -0.882 | -1.163 |
| 2017-08-07 | 0.768 | 0.742 | -0.871 | -1.142 |
| 2017-08-08 | 0.768 | 0.752 | -0.869 | -1.13 |
| 2017-08-09 | 0.778 | 0.753 | -0.859 | -1.128 |
| 2017-08-10 | 0.779 | 0.764 | -0.859 | -1.118 |
| 2017-08-11 | 0.779 | 0.766 | -0.865 | -1.115 |
| 2017-08-14 | 0.779 | 0.768 | -0.864 | -1.108 |
| 2017-08-15 | 0.779 | 0.767 | -0.864 | -1.118 |
| 2017-08-16 | 0.779 | 0.777 | -0.867 | -1.116 |
| 2017-08-17 | 0.789 | 0.778 | -0.856 | -1.113 |
| 2017-08-18 | 0.789 | 0.778 | -0.855 | -1.106 |
| 2017-08-21 | 0.789 | 0.778 | -0.854 | -1.107 |
| 2017-08-22 | 0.788 | 0.788 | -0.857 | -1.097 |
| 2017-08-23 | 0.789 | 0.789 | -0.857 | -1.098 |
| 2017-08-24 | 0.789 | 0.789 | -0.857 | -1.093 |
| 2017-08-25 | 0.789 | 0.789 | -0.858 | -1.098 |
| 2017-08-28 | 0.789 | 0.789 | -0.858 | -1.098 |
| 2017-08-29 | 0.79 | 0.79 | -0.857 | -1.084 |
| 2017-08-30 | 0.79 | 0.791 | -0.856 | -1.082 |
| 2017-08-31 | 0.789 | 0.791 | -0.858 | -1.083 |
| 2017-09-01 | 0.789 | 0.791 | -0.856 | -1.082 |
| 2017-09-04 | 0.789 | 0.791 | -0.856 | -1.083 |
| 2017-09-05 | 0.789 | 0.791 | -0.857 | -1.085 |
| 2017-09-06 | 0.789 | 0.793 | -0.857 | -1.078 |
| 2017-09-07 | 0.79 | 0.792 | -0.857 | -1.079 |
| 2017-09-08 | 0.791 | 0.796 | -0.85 | -1.065 |
| 2017-09-11 | 0.791 | 0.798 | -0.857 | -1.069 |
| 2017-09-12 | 0.79 | 0.809 | -0.859 | -1.07 |
| 2017-09-13 | 0.789 | 0.809 | -0.86 | -1.072 |
| 2017-09-14 | 0.789 | 0.811 | -0.861 | -1.08 |
| 2017-09-15 | 0.789 | 0.811 | -0.864 | -1.092 |
| 2017-09-18 | 0.789 | 0.811 | -0.865 | -1.1 |
| 2017-09-19 | 0.79 | 0.811 | -0.866 | -1.104 |
| 2017-09-20 | 0.789 | 0.811 | -0.863 | -1.107 |
| 2017-09-21 | 0.79 | 0.811 | -0.868 | -1.128 |
| 2017-09-22 | 0.789 | 0.811 | -0.869 | -1.135 |
| 2017-09-25 | 0.789 | 0.811 | -0.87 | -1.135 |
| 2017-09-26 | 0.789 | 0.811 | -0.871 | -1.136 |
| 2017-09-27 | 0.799 | 0.811 | -0.863 | -1.145 |
| 2017-09-29 | 0.799 | 0.822 | -0.864 | -1.132 |
| 2017-10-02 | 0.799 | 0.822 | -0.866 | -1.141 |
| 2017-10-03 | 0.8 | 0.821 | -0.872 | -1.149 |
| 2017-10-04 | 0.799 | 0.818 | -0.877 | -1.148 |
| 2017-10-05 | 0.809 | 0.831 | -0.869 | -1.14 |
| 2017-10-06 | 0.819 | 0.833 | -0.86 | -1.145 |
| 2017-10-09 | 0.819 | 0.846 | -0.866 | -1.139 |
| 2017-10-10 | 0.819 | 0.851 | -0.867 | -1.137 |
| 2017-10-11 | 0.819 | 0.841 | -0.869 | -1.15 |
| 2017-10-12 | 0.819 | 0.841 | -0.869 | -1.148 |
| 2017-10-13 | 0.829 | 0.851 | -0.853 | -1.143 |
| 2017-10-16 | 0.839 | 0.862 | -0.844 | -1.13 |
| 2017-10-17 | 0.839 | 0.873 | -0.847 | -1.131 |
| 2017-10-18 | 0.849 | 0.883 | -0.843 | -1.135 |
| 2017-10-19 | 0.849 | 0.893 | -0.842 | -1.118 |
| 2017-10-20 | 0.849 | 0.893 | -0.842 | -1.118 |
| 2017-10-23 | 0.859 | 0.903 | -0.837 | -1.115 |
| 2017-10-24 | 0.87 | 0.903 | -0.831 | -1.115 |
| 2017-10-25 | 0.871 | 0.913 | -0.834 | -1.115 |
| 2017-10-26 | 0.881 | 0.923 | -0.828 | -1.103 |
| 2017-10-27 | 0.891 | 0.924 | -0.82 | -1.108 |
| 2017-10-30 | 0.901 | 0.935 | -0.807 | -1.092 |
| 2017-10-31 | 0.911 | 0.955 | -0.801 | -1.078 |
| 2017-11-01 | 0.919 | 0.957 | -0.795 | -1.086 |
| 2017-11-02 | 0.939 | 0.979 | -0.781 | -1.073 |
| 2017-11-03 | 1.019 | 1.061 | -0.702 | -0.993 |
| 2017-11-06 | 1.029 | 1.081 | -0.697 | -0.974 |
| 2017-11-07 | 1.029 | 1.08 | -0.703 | -0.978 |
| 2017-11-08 | 1.039 | 1.081 | -0.7 | -0.983 |
| 2017-11-09 | 1.049 | 1.091 | -0.693 | -0.982 |
| 2017-11-10 | 1.049 | 1.101 | -0.693 | -0.971 |
| 2017-11-13 | 1.049 | 1.101 | -0.696 | -0.974 |
| 2017-11-14 | 1.049 | 1.111 | -0.699 | -0.973 |
| 2017-11-15 | 1.049 | 1.112 | -0.702 | -0.966 |
| 2017-11-16 | 1.049 | 1.122 | -0.716 | -0.971 |
| 2017-11-20 | 1.059 | 1.117 | -0.716 | -0.978 |
| 2017-11-21 | 1.059 | 1.126 | -0.724 | -0.987 |
| 2017-11-22 | 1.059 | 1.126 | -0.732 | -0.994 |
| 2017-11-23 | 1.059 | 1.126 | -0.732 | -0.99 |
| 2017-11-24 | 1.069 | 1.126 | -0.728 | -0.996 |
| 2017-11-27 | 1.069 | 1.126 | -0.737 | -1.003 |
| 2017-11-28 | 1.069 | 1.126 | -0.739 | -0.998 |
| 2017-11-29 | 1.069 | 1.137 | -0.741 | -0.995 |
| 2017-11-30 | 1.069 | 1.138 | -0.747 | -1.002 |
| 2017-12-01 | 1.066 | 1.128 | -0.755 | -1.02 |
| 2017-12-04 | 1.066 | 1.14 | -0.768 | -1.032 |
| 2017-12-05 | 1.066 | 1.141 | -0.775 | -1.04 |
| 2017-12-06 | 1.066 | 1.141 | -0.783 | -1.038 |
| 2017-12-07 | 1.065 | 1.14 | -0.796 | -1.047 |
| 2017-12-08 | 1.076 | 1.141 | -0.799 | -1.061 |
| 2017-12-11 | 1.077 | 1.141 | -0.813 | -1.064 |
| 2017-12-12 | 1.077 | 1.141 | -0.824 | -1.078 |
| 2017-12-13 | 1.079 | 1.151 | -0.838 | -1.079 |
| 2017-12-14 | 1.091 | 1.162 | -0.84 | -1.069 |
| 2017-12-15 | 1.089 | 1.163 | -0.853 | -1.078 |
| 2017-12-18 | 1.089 | 1.164 | -0.865 | -1.088 |
| 2017-12-19 | 1.089 | 1.164 | -0.882 | -1.099 |
| 2017-12-20 | 1.089 | 1.158 | -0.898 | -1.114 |
| 2017-12-21 | 1.089 | 1.156 | -0.915 | -1.121 |
| 2017-12-22 | 1.089 | 1.156 | -0.926 | -1.132 |
| 2017-12-27 | 1.089 | 1.156 | -0.933 | -1.141 |
| 2017-12-28 | 1.089 | 1.156 | -0.935 | -1.136 |
| 2017-12-29 | 1.089 | 1.156 | -0.934 | -1.137 |
| 2018-01-02 | 1.089 | 1.156 | -0.937 | -1.139 |
| 2018-01-03 | 1.089 | 1.157 | -0.936 | -1.148 |
| 2018-01-04 | 1.089 | 1.157 | -0.944 | -1.168 |
| 2018-01-05 | 1.089 | 1.157 | -0.944 | -1.18 |
| 2018-01-08 | 1.089 | 1.157 | -0.948 | -1.181 |
| 2018-01-09 | 1.089 | 1.157 | -0.945 | -1.176 |
| 2018-01-10 | 1.089 | 1.156 | -0.949 | -1.186 |
| 2018-01-11 | 1.109 | 1.178 | -0.94 | -1.174 |
| 2018-01-12 | 1.089 | 1.156 | -0.962 | -1.203 |
| 2018-01-15 | 1.089 | 1.157 | -0.971 | -1.219 |
| 2018-01-16 | 1.089 | 1.156 | -0.974 | -1.226 |
| 2018-01-17 | 1.098 | 1.166 | -0.969 | -1.234 |
| 2018-01-18 | 1.098 | 1.171 | -0.975 | -1.248 |
| 2018-01-19 | 1.098 | 1.171 | -0.974 | -1.248 |
| 2018-01-22 | 1.098 | 1.171 | -0.971 | -1.248 |
| 2018-01-23 | 1.098 | 1.171 | -0.975 | -1.245 |
| 2018-01-24 | 1.098 | 1.172 | -0.982 | -1.251 |
| 2018-01-25 | 1.108 | 1.182 | -0.972 | -1.241 |
| 2018-01-26 | 1.108 | 1.182 | -0.972 | -1.241 |
| 2018-01-29 | 1.118 | 1.191 | -0.982 | -1.264 |
| 2018-01-30 | 1.138 | 1.201 | -0.963 | -1.253 |
| 2018-01-31 | 1.138 | 1.211 | -0.968 | -1.247 |
| 2018-02-01 | 1.158 | 1.221 | -0.957 | -1.263 |
| 2018-02-02 | 1.239 | 1.301 | -0.879 | -1.181 |
| 2018-02-05 | 1.239 | 1.301 | -0.883 | -1.183 |
| 2018-02-06 | 1.239 | 1.301 | -0.881 | -1.168 |
| 2018-02-07 | 1.239 | 1.301 | -0.89 | -1.176 |
| 2018-02-08 | 1.239 | 1.301 | -0.9 | -1.188 |
| 2018-02-09 | 1.229 | 1.301 | -0.92 | -1.203 |
| 2018-02-12 | 1.229 | 1.301 | -0.933 | -1.209 |
| 2018-02-13 | 1.229 | 1.301 | -0.939 | -1.217 |
| 2018-02-14 | 1.228 | 1.302 | -0.95 | -1.228 |
| 2018-02-15 | 1.228 | 1.301 | -0.972 | -1.271 |
| 2018-02-16 | 1.228 | 1.302 | -0.985 | -1.281 |
| 2018-02-19 | 1.239 | 1.303 | -0.982 | -1.288 |
| 2018-02-20 | 1.239 | 1.303 | -0.994 | -1.298 |
| 2018-02-21 | 1.239 | 1.301 | -1.01 | -1.316 |
| 2018-02-22 | 1.238 | 1.311 | -1.034 | -1.33 |
| 2018-02-23 | 1.238 | 1.311 | -1.046 | -1.34 |
| 2018-02-26 | 1.238 | 1.31 | -1.074 | -1.349 |
| 2018-02-27 | 1.238 | 1.311 | -1.096 | -1.361 |
| 2018-02-28 | 1.237 | 1.311 | -1.107 | -1.382 |
| 2018-03-01 | 1.237 | 1.311 | -1.115 | -1.387 |
| 2018-03-02 | 1.237 | 1.311 | -1.115 | -1.377 |
| 2018-03-05 | 1.237 | 1.311 | -1.125 | -1.378 |
| 2018-03-06 | 1.237 | 1.311 | -1.137 | -1.392 |
| 2018-03-07 | 1.237 | 1.311 | -1.147 | -1.399 |
| 2018-03-08 | 1.237 | 1.311 | -1.161 | -1.413 |
| 2018-03-09 | 1.227 | 1.311 | -1.189 | -1.424 |
| 2018-03-12 | 1.227 | 1.311 | -1.207 | -1.443 |
| 2018-03-13 | 1.227 | 1.311 | -1.224 | -1.458 |
| 2018-03-14 | 1.227 | 1.311 | -1.245 | -1.47 |
| 2018-03-15 | 1.228 | 1.311 | -1.278 | -1.481 |
| 2018-03-16 | 1.228 | 1.312 | -1.302 | -1.494 |
| 2018-03-19 | 1.229 | 1.312 | -1.322 | -1.513 |
| 2018-03-20 | 1.229 | 1.311 | -1.348 | -1.531 |
| 2018-03-21 | 1.229 | 1.311 | -1.371 | -1.556 |
| 2018-03-22 | 1.229 | 1.311 | -1.386 | -1.557 |
| 2018-03-23 | 1.229 | 1.31 | -1.392 | -1.546 |
| 2018-03-26 | 1.229 | 1.311 | -1.395 | -1.552 |
| 2018-03-27 | 1.229 | 1.311 | -1.402 | -1.551 |
| 2018-03-28 | 1.229 | 1.311 | -1.408 | -1.539 |
| 2018-03-29 | 1.228 | 1.31 | -1.412 | -1.543 |
| 2018-04-03 | 1.228 | 1.31 | -1.421 | -1.55 |
| 2018-04-04 | 1.228 | 1.31 | -1.425 | -1.561 |
| 2018-04-05 | 1.228 | 1.311 | -1.431 | -1.58 |
| 2018-04-06 | 1.229 | 1.311 | -1.437 | -1.588 |
| 2018-04-09 | 1.229 | 1.311 | -1.437 | -1.584 |
| 2018-04-10 | 1.229 | 1.311 | -1.439 | -1.584 |
| 2018-04-11 | 1.229 | 1.31 | -1.442 | -1.589 |
| 2018-04-12 | 1.229 | 1.311 | -1.448 | -1.597 |
| 2018-04-13 | 1.229 | 1.31 | -1.453 | -1.611 |
| 2018-04-16 | 1.229 | 1.309 | -1.455 | -1.624 |
| 2018-04-17 | 1.228 | 1.319 | -1.455 | -1.616 |
| 2018-04-18 | 1.228 | 1.309 | -1.459 | -1.628 |
| 2018-04-19 | 1.228 | 1.309 | -1.459 | -1.628 |
| 2018-04-20 | 1.228 | 1.309 | -1.459 | -1.628 |
| 2018-04-23 | 1.228 | 1.309 | -1.46 | -1.649 |
| 2018-04-24 | 1.228 | 1.309 | -1.462 | -1.649 |
| 2018-04-25 | 1.228 | 1.309 | -1.466 | -1.652 |
| 2018-04-26 | 1.228 | 1.309 | -1.459 | -1.65 |
| 2018-04-27 | 1.229 | 1.309 | -1.458 | -1.66 |
| 2018-04-30 | 1.229 | 1.309 | -1.463 | -1.65 |
| 2018-05-02 | 1.229 | 1.309 | -1.463 | -1.657 |
| 2018-05-03 | 1.228 | 1.309 | -1.463 | -1.653 |
| 2018-05-04 | 1.228 | 1.31 | -1.469 | -1.657 |
| 2018-05-07 | 1.228 | 1.309 | -1.469 | -1.657 |
| 2018-05-09 | 1.227 | 1.309 | -1.456 | -1.651 |
| 2018-05-10 | 1.226 | 1.309 | -1.455 | -1.648 |
| 2018-05-11 | 1.227 | 1.309 | -1.442 | -1.646 |
| 2018-05-14 | 1.226 | 1.31 | -1.43 | -1.637 |
| 2018-05-15 | 1.226 | 1.308 | -1.421 | -1.634 |
| 2018-05-16 | 1.226 | 1.308 | -1.426 | -1.641 |
| 2018-05-17 | 1.226 | 1.308 | -1.431 | -1.646 |
| 2018-05-18 | 1.226 | 1.309 | -1.429 | -1.645 |
| 2018-05-21 | 1.225 | 1.307 | -1.43 | -1.645 |
| 2018-05-22 | 1.224 | 1.309 | -1.43 | -1.644 |
| 2018-05-23 | 1.223 | 1.309 | -1.43 | -1.634 |
| 2018-05-24 | 1.224 | 1.307 | -1.419 | -1.617 |
| 2018-05-25 | 1.223 | 1.308 | -1.418 | -1.611 |
| 2018-05-28 | 1.222 | 1.306 | -1.418 | -1.611 |
| 2018-05-29 | 1.221 | 1.306 | -1.407 | -1.588 |
| 2018-05-30 | 1.221 | 1.304 | -1.4 | -1.58 |
| 2018-05-31 | 1.221 | 1.304 | -1.421 | -1.598 |
| 2018-06-01 | 1.221 | 1.304 | -1.418 | -1.604 |
| 2018-06-04 | 1.221 | 1.304 | -1.414 | -1.62 |
| 2018-06-05 | 1.222 | 1.302 | -1.419 | -1.619 |
| 2018-06-06 | 1.221 | 1.3 | -1.421 | -1.621 |
| 2018-06-07 | 1.221 | 1.3 | -1.427 | -1.634 |
| 2018-06-08 | 1.221 | 1.3 | -1.426 | -1.62 |
| 2018-06-11 | 1.241 | 1.311 | -1.413 | -1.628 |
| 2018-06-12 | 1.241 | 1.321 | -1.416 | -1.625 |
| 2018-06-13 | 1.241 | 1.321 | -1.421 | -1.627 |
| 2018-06-14 | 1.251 | 1.321 | -1.405 | -1.632 |
| 2018-06-15 | 1.241 | 1.323 | -1.406 | -1.632 |
| 2018-06-18 | 1.253 | 1.334 | -1.395 | -1.622 |
| 2018-06-19 | 1.253 | 1.331 | -1.4 | -1.613 |
| 2018-06-20 | 1.253 | 1.332 | -1.402 | -1.622 |
| 2018-06-21 | 1.253 | 1.332 | -1.405 | -1.62 |
| 2018-06-22 | 1.253 | 1.34 | -1.409 | -1.617 |
| 2018-06-25 | 1.254 | 1.341 | -1.407 | -1.606 |
| 2018-06-26 | 1.253 | 1.341 | -1.406 | -1.611 |
| 2018-06-27 | 1.254 | 1.341 | -1.404 | -1.603 |
| 2018-06-28 | 1.484 | 1.531 | -1.177 | -1.413 |
| 2018-06-29 | 1.481 | 1.531 | -1.176 | -1.414 |
| 2018-07-02 | 1.481 | 1.531 | -1.182 | -1.422 |
| 2018-07-03 | 1.481 | 1.531 | -1.177 | -1.423 |
| 2018-07-04 | 1.491 | 1.541 | -1.167 | -1.413 |
| 2018-07-09 | 1.491 | 1.551 | -1.163 | -1.406 |
| 2018-07-10 | 1.491 | 1.55 | -1.167 | -1.411 |
| 2018-07-11 | 1.501 | 1.559 | -1.157 | -1.398 |
| 2018-07-12 | 1.501 | 1.559 | -1.159 | -1.405 |
| 2018-07-13 | 1.501 | 1.569 | -1.156 | -1.397 |
| 2018-07-16 | 1.501 | 1.569 | -1.153 | -1.398 |
| 2018-07-17 | 1.511 | 1.579 | -1.152 | -1.396 |
| 2018-07-18 | 1.501 | 1.569 | -1.168 | -1.411 |
| 2018-07-19 | 1.511 | 1.569 | -1.157 | -1.417 |
| 2018-07-20 | 1.501 | 1.569 | -1.162 | -1.412 |
| 2018-07-23 | 1.511 | 1.569 | -1.145 | -1.409 |
| 2018-07-24 | 1.511 | 1.579 | -1.145 | -1.408 |
| 2018-07-25 | 1.521 | 1.589 | -1.137 | -1.398 |
| 2018-07-26 | 1.52 | 1.589 | -1.139 | -1.407 |
| 2018-07-27 | 1.52 | 1.589 | -1.142 | -1.411 |
| 2018-07-30 | 1.529 | 1.609 | -1.133 | -1.391 |
| 2018-07-31 | 1.539 | 1.608 | -1.129 | -1.398 |
| 2018-08-01 | 1.549 | 1.627 | -1.118 | -1.382 |
| 2018-08-02 | 1.559 | 1.626 | -1.1 | -1.378 |
| 2018-08-03 | 1.739 | 1.786 | -0.923 | -1.217 |
| 2018-08-06 | 1.759 | 1.816 | -0.903 | -1.187 |
| 2018-08-07 | 1.769 | 1.826 | -0.891 | -1.174 |
| 2018-08-08 | 1.769 | 1.836 | -0.891 | -1.168 |
| 2018-08-09 | 1.779 | 1.843 | -0.878 | -1.158 |
| 2018-08-10 | 1.779 | 1.839 | -0.859 | -1.146 |
| 2018-08-13 | 1.779 | 1.846 | -0.854 | -1.123 |
| 2018-08-14 | 1.779 | 1.846 | -0.855 | -1.134 |
| 2018-08-15 | 1.779 | 1.846 | -0.852 | -1.135 |
| 2018-08-16 | 1.779 | 1.846 | -0.862 | -1.137 |
| 2018-08-17 | 1.789 | 1.847 | -0.842 | -1.133 |
| 2018-08-20 | 1.789 | 1.857 | -0.84 | -1.123 |
| 2018-08-21 | 1.799 | 1.867 | -0.83 | -1.108 |
| 2018-08-22 | 1.799 | 1.877 | -0.832 | -1.098 |
| 2018-08-23 | 1.799 | 1.877 | -0.831 | -1.102 |
| 2018-08-24 | 1.799 | 1.876 | -0.837 | -1.11 |
| 2018-08-27 | 1.809 | 1.876 | -0.827 | -1.11 |
| 2018-08-28 | 1.809 | 1.886 | -0.825 | -1.108 |
| 2018-08-29 | 1.809 | 1.885 | -0.823 | -1.113 |
| 2018-08-30 | 1.809 | 1.896 | -0.831 | -1.112 |
| 2018-08-31 | 1.819 | 1.896 | -0.821 | -1.11 |
| 2018-09-03 | 1.819 | 1.896 | -0.816 | -1.109 |
| 2018-09-04 | 1.819 | 1.906 | -0.823 | -1.103 |
| 2018-09-05 | 1.829 | 1.907 | -0.807 | -1.104 |
| 2018-09-06 | 1.829 | 1.917 | -0.817 | -1.099 |
| 2018-09-07 | 1.829 | 1.907 | -0.821 | -1.106 |
| 2018-09-10 | 1.829 | 1.917 | -0.824 | -1.113 |
| 2018-09-11 | 1.839 | 1.936 | -0.814 | -1.098 |
| 2018-09-12 | 1.849 | 1.946 | -0.802 | -1.085 |
| 2018-09-13 | 1.859 | 1.948 | -0.794 | -1.093 |
| 2018-09-14 | 1.859 | 1.958 | -0.797 | -1.09 |
| 2018-09-17 | 1.859 | 1.959 | -0.799 | -1.089 |
| 2018-09-18 | 1.869 | 1.968 | -0.787 | -1.08 |
| 2018-09-19 | 1.878 | 1.977 | -0.793 | -1.077 |
| 2018-09-20 | 1.879 | 1.978 | -0.806 | -1.087 |
| 2018-09-21 | 1.879 | 1.988 | -0.813 | -1.088 |
| 2018-09-24 | 1.879 | 1.987 | -0.814 | -1.089 |
| 2018-09-25 | 1.889 | 1.985 | -0.811 | -1.092 |
| 2018-09-26 | 1.899 | 1.994 | -0.806 | -1.084 |
| 2018-09-27 | 2.018 | 2.051 | -0.696 | -1.027 |
| 2018-10-01 | 2.037 | 2.058 | -0.678 | -1.026 |
| 2018-10-02 | 2.048 | 2.067 | -0.678 | -1.015 |
| 2018-10-03 | 2.048 | 2.077 | -0.678 | -1.007 |
| 2018-10-04 | 2.058 | 2.089 | -0.67 | -1.027 |
| 2018-10-05 | 2.058 | 2.088 | -0.668 | -1.028 |
| 2018-10-08 | 2.058 | 2.088 | -0.674 | -1.028 |
| 2018-10-09 | 2.068 | 2.086 | -0.67 | -1.032 |
| 2018-10-10 | 2.068 | 2.096 | -0.675 | -1.029 |
| 2018-10-11 | 2.068 | 2.106 | -0.686 | -1.004 |
| 2018-10-12 | 2.068 | 2.117 | -0.686 | -1.003 |
| 2018-10-15 | 2.078 | 2.116 | -0.689 | -1.007 |
| 2018-10-16 | 2.078 | 2.126 | -0.689 | -0.997 |
| 2018-10-17 | 2.078 | 2.126 | -0.69 | -0.996 |
| 2018-10-18 | 2.077 | 2.125 | -0.709 | -1.031 |
| 2018-10-19 | 2.087 | 2.124 | -0.707 | -1.05 |
| 2018-10-22 | 2.087 | 2.121 | -0.717 | -1.061 |
| 2018-10-23 | 2.087 | 2.129 | -0.72 | -1.054 |
| 2018-10-24 | 2.097 | 2.129 | -0.71 | -1.054 |
| 2018-10-25 | 2.097 | 2.119 | -0.71 | -1.064 |
| 2018-10-26 | 2.108 | 2.128 | -0.73 | -1.077 |
| 2018-10-29 | 2.118 | 2.138 | -0.72 | -1.067 |
| 2018-10-30 | 2.118 | 2.138 | -0.72 | -1.067 |
| 2018-10-31 | 2.128 | 2.149 | -0.748 | -1.084 |
| 2018-11-01 | 2.138 | 2.159 | -0.739 | -1.074 |
| 2018-11-02 | 2.278 | 2.288 | -0.632 | -0.965 |
| 2018-11-05 | 2.288 | 2.288 | -0.619 | -0.977 |
| 2018-11-06 | 2.288 | 2.298 | -0.619 | -0.967 |
| 2018-11-07 | 2.287 | 2.309 | -0.631 | -0.965 |
| 2018-11-08 | 2.297 | 2.319 | -0.621 | -0.955 |
| 2018-11-09 | 2.306 | 2.328 | -0.628 | -0.964 |
| 2018-11-12 | 2.306 | 2.328 | -0.624 | -0.955 |
| 2018-11-13 | 2.306 | 2.328 | -0.624 | -0.955 |
| 2018-11-14 | 2.306 | 2.337 | -0.639 | -0.94 |
| 2018-11-15 | 2.316 | 2.347 | -0.64 | -0.918 |
| 2018-11-16 | 2.316 | 2.347 | -0.64 | -0.918 |
| 2018-11-19 | 2.316 | 2.348 | -0.646 | -0.907 |
| 2018-11-20 | 2.326 | 2.358 | -0.643 | -0.887 |
| 2018-11-21 | 2.326 | 2.358 | -0.643 | -0.887 |
| 2018-11-22 | 2.326 | 2.358 | -0.679 | -0.9 |
| 2018-11-23 | 2.336 | 2.367 | -0.671 | -0.901 |
| 2018-11-26 | 2.336 | 2.366 | -0.687 | -0.908 |
| 2018-11-27 | 2.336 | 2.366 | -0.687 | -0.908 |
| 2018-11-28 | 2.336 | 2.366 | -0.687 | -0.908 |
| 2018-11-29 | 2.336 | 2.366 | -0.687 | -0.908 |
| 2018-11-30 | 2.336 | 2.366 | -0.716 | -0.9 |
| 2018-12-03 | 2.326 | 2.353 | -0.741 | -0.928 |
| 2018-12-04 | 2.326 | 2.352 | -0.729 | -0.923 |
| 2018-12-05 | 2.326 | 2.351 | -0.756 | -0.916 |
| 2018-12-06 | 2.325 | 2.35 | -0.757 | -0.902 |
| 2018-12-07 | 2.325 | 2.347 | -0.761 | -0.891 |
| 2018-12-10 | 2.324 | 2.344 | -0.766 | -0.874 |
| 2018-12-11 | 2.322 | 2.341 | -0.769 | -0.88 |
| 2018-12-12 | 2.322 | 2.341 | -0.768 | -0.891 |
| 2018-12-13 | 2.331 | 2.339 | -0.768 | -0.902 |
| 2018-12-14 | 2.331 | 2.338 | -0.781 | -0.888 |
| 2018-12-17 | 2.331 | 2.337 | -0.784 | -0.894 |
| 2018-12-18 | 2.331 | 2.335 | -0.772 | -0.851 |
| 2018-12-19 | 2.329 | 2.334 | -0.77 | -0.843 |
| 2018-12-20 | 2.329 | 2.334 | -0.77 | -0.843 |
| 2018-12-21 | 2.329 | 2.334 | -0.77 | -0.843 |
| 2018-12-27 | 2.319 | 2.319 | -0.793 | -0.832 |
| 2018-12-28 | 2.33 | 2.329 | -0.777 | -0.803 |
| 2018-12-31 | 2.319 | 2.327 | -0.798 | -0.795 |
| 2019-01-02 | 2.319 | 2.317 | -0.798 | -0.805 |
| 2019-01-03 | 2.319 | 2.317 | -0.798 | -0.805 |
| 2019-01-04 | 2.319 | 2.327 | -0.798 | -0.795 |
| 2019-01-07 | 2.32 | 2.329 | -0.787 | -0.785 |
| 2019-01-08 | 2.32 | 2.329 | -0.787 | -0.785 |
| 2019-01-09 | 2.318 | 2.328 | -0.789 | -0.829 |
| 2019-01-10 | 2.318 | 2.328 | -0.787 | -0.809 |
| 2019-01-11 | 2.318 | 2.328 | -0.787 | -0.809 |
| 2019-01-14 | 2.318 | 2.328 | -0.769 | -0.801 |
| 2019-01-15 | 2.318 | 2.328 | -0.769 | -0.801 |
| 2019-01-16 | 2.318 | 2.327 | -0.77 | -0.82 |
| 2019-01-17 | 2.318 | 2.327 | -0.77 | -0.82 |
| 2019-01-18 | 2.318 | 2.336 | -0.751 | -0.81 |
| 2019-01-21 | 2.318 | 2.336 | -0.751 | -0.81 |
| 2019-01-22 | 2.318 | 2.335 | -0.769 | -0.817 |
| 2019-01-23 | 2.318 | 2.336 | -0.761 | -0.815 |
| 2019-01-24 | 2.306 | 2.335 | -0.765 | -0.809 |
| 2019-01-25 | 2.306 | 2.335 | -0.765 | -0.809 |
| 2019-01-28 | 2.307 | 2.332 | -0.751 | -0.81 |
| 2019-01-29 | 2.296 | 2.329 | -0.754 | -0.804 |
| 2019-01-30 | 2.296 | 2.319 | -0.754 | -0.814 |
| 2019-01-31 | 2.298 | 2.319 | -0.747 | -0.773 |
| 2019-02-01 | 2.298 | 2.32 | -0.743 | -0.752 |
| 2019-02-04 | 2.298 | 2.31 | -0.743 | -0.762 |
| 2019-02-05 | 2.298 | 2.31 | -0.743 | -0.762 |
| 2019-02-06 | 2.298 | 2.308 | -0.748 | -0.762 |
| 2019-02-07 | 2.298 | 2.308 | -0.707 | -0.748 |
| 2019-02-08 | 2.298 | 2.309 | -0.708 | -0.736 |
| 2019-02-11 | 2.298 | 2.309 | -0.698 | -0.724 |
| 2019-02-12 | 2.298 | 2.309 | -0.698 | -0.724 |
| 2019-02-13 | 2.308 | 2.298 | -0.684 | -0.726 |
| 2019-02-14 | 2.308 | 2.298 | -0.694 | -0.727 |
| 2019-02-15 | 2.318 | 2.298 | -0.684 | -0.727 |
| 2019-02-18 | 2.328 | 2.298 | -0.624 | -0.717 |
| 2019-02-19 | 2.328 | 2.298 | -0.624 | -0.717 |
| 2019-02-20 | 2.328 | 2.298 | -0.643 | -0.684 |
| 2019-02-21 | 2.33 | 2.298 | -0.631 | -0.699 |
| 2019-02-22 | 2.33 | 2.298 | -0.626 | -0.702 |
| 2019-02-25 | 2.329 | 2.308 | -0.619 | -0.683 |
| 2019-02-26 | 2.329 | 2.308 | -0.619 | -0.683 |
| 2019-02-27 | 2.33 | 2.308 | -0.606 | -0.666 |
| 2019-02-28 | 2.329 | 2.308 | -0.595 | -0.665 |
| 2019-03-01 | 2.339 | 2.308 | -0.585 | -0.665 |
| 2019-03-04 | 2.339 | 2.308 | -0.578 | -0.683 |
| 2019-03-05 | 2.338 | 2.308 | -0.577 | -0.684 |
| 2019-03-06 | 2.338 | 2.308 | -0.577 | -0.684 |
| 2019-03-07 | 2.338 | 2.318 | -0.577 | -0.674 |
| 2019-03-08 | 2.338 | 2.308 | -0.577 | -0.684 |
| 2019-03-11 | 2.338 | 2.308 | -0.578 | -0.669 |
| 2019-03-12 | 2.339 | 2.308 | -0.563 | -0.668 |
| 2019-03-13 | 2.34 | 2.309 | -0.581 | -0.659 |
| 2019-03-14 | 2.339 | 2.309 | -0.585 | -0.646 |
| 2019-03-15 | 2.339 | 2.309 | -0.585 | -0.646 |
| 2019-03-18 | 2.34 | 2.309 | -0.603 | -0.618 |
| 2019-03-19 | 2.34 | 2.309 | -0.603 | -0.618 |
| 2019-03-20 | 2.339 | 2.309 | -0.577 | -0.613 |
| 2019-03-21 | 2.339 | 2.308 | -0.572 | -0.594 |
| 2019-03-22 | 2.339 | 2.308 | -0.58 | -0.587 |
| 2019-03-25 | 2.33 | 2.308 | -0.589 | -0.546 |
| 2019-03-26 | 2.329 | 2.308 | -0.577 | -0.525 |
| 2019-03-27 | 2.329 | 2.309 | -0.581 | -0.483 |
| 2019-03-28 | 2.329 | 2.309 | -0.581 | -0.483 |
| 2019-03-29 | 2.331 | 2.312 | -0.58 | -0.511 |
| 2019-04-01 | 2.33 | 2.312 | -0.575 | -0.53 |
| 2019-04-02 | 2.331 | 2.312 | -0.582 | -0.533 |
| 2019-04-03 | 2.33 | 2.312 | -0.578 | -0.549 |
| 2019-04-04 | 2.33 | 2.312 | -0.569 | -0.536 |
| 2019-04-05 | 2.33 | 2.312 | -0.572 | -0.551 |
| 2019-04-08 | 2.33 | 2.312 | -0.564 | -0.55 |
| 2019-04-09 | 2.33 | 2.312 | -0.561 | -0.554 |
| 2019-04-10 | 2.33 | 2.312 | -0.583 | -0.54 |
| 2019-04-11 | 2.33 | 2.312 | -0.577 | -0.534 |
| 2019-04-12 | 2.33 | 2.322 | -0.581 | -0.538 |
| 2019-04-15 | 2.33 | 2.321 | -0.568 | -0.545 |
| 2019-04-16 | 2.33 | 2.322 | -0.581 | -0.545 |
| 2019-04-17 | 2.331 | 2.322 | -0.571 | -0.552 |
| 2019-04-18 | 2.331 | 2.322 | -0.571 | -0.552 |
| 2019-04-23 | 2.331 | 2.332 | -0.56 | -0.516 |
| 2019-04-24 | 2.332 | 2.332 | -0.566 | -0.505 |
| 2019-04-25 | 2.332 | 2.332 | -0.562 | -0.496 |
| 2019-04-26 | 2.34 | 2.343 | -0.553 | -0.487 |
| 2019-04-29 | 2.351 | 2.344 | -0.539 | -0.483 |
| 2019-04-30 | 2.36 | 2.344 | -0.526 | -0.487 |
| 2019-05-02 | 2.359 | 2.344 | -0.515 | -0.507 |
| 2019-05-03 | 2.509 | 2.454 | -0.36 | -0.406 |
| 2019-05-06 | 2.518 | 2.454 | -0.35 | -0.406 |
| 2019-05-07 | 2.518 | 2.455 | -0.352 | -0.381 |
| 2019-05-09 | 2.518 | 2.455 | -0.352 | -0.381 |
| 2019-05-10 | 2.509 | 2.458 | -0.328 | -0.353 |
| 2019-05-13 | 2.511 | 2.448 | -0.318 | -0.342 |
| 2019-05-14 | 2.511 | 2.451 | -0.324 | -0.309 |
| 2019-05-15 | 2.511 | 2.445 | -0.325 | -0.312 |
| 2019-05-16 | 2.512 | 2.448 | -0.32 | -0.294 |
| 2019-05-17 | 2.512 | 2.448 | -0.32 | -0.294 |
| 2019-05-20 | 2.514 | 2.455 | -0.323 | -0.327 |
| 2019-05-21 | 2.513 | 2.465 | -0.323 | -0.334 |
| 2019-05-22 | 2.511 | 2.465 | -0.325 | -0.346 |
| 2019-05-23 | 2.5 | 2.458 | -0.331 | -0.335 |
| 2019-05-24 | 2.5 | 2.458 | -0.331 | -0.335 |
| 2019-05-27 | 2.5 | 2.458 | -0.331 | -0.335 |
| 2019-05-28 | 2.505 | 2.463 | -0.334 | -0.29 |
| 2019-05-29 | 2.505 | 2.463 | -0.334 | -0.29 |
| 2019-05-30 | 2.512 | 2.478 | -0.312 | -0.2 |
| 2019-05-31 | 2.512 | 2.478 | -0.312 | -0.2 |
| 2019-06-03 | 2.513 | 2.485 | -0.288 | -0.103 |
| 2019-06-04 | 2.502 | 2.477 | -0.294 | -0.105 |
| 2019-06-05 | 2.5 | 2.477 | -0.292 | -0.083 |
| 2019-06-06 | 2.5 | 2.477 | -0.292 | -0.083 |
| 2019-06-07 | 2.499 | 2.475 | -0.271 | -0.046 |
| 2019-06-10 | 2.488 | 2.468 | -0.266 | -0.048 |
| 2019-06-11 | 2.489 | 2.468 | -0.28 | -0.053 |
| 2019-06-12 | 2.488 | 2.463 | -0.258 | -0.043 |
| 2019-06-13 | 2.488 | 2.458 | -0.24 | -0.016 |
| 2019-06-14 | 2.488 | 2.461 | -0.232 | 0.043 |
| 2019-06-17 | 2.49 | 2.467 | -0.248 | 0.003 |
| 2019-06-18 | 2.492 | 2.474 | -0.217 | 0.026 |
| 2019-06-19 | 2.506 | 2.498 | -0.216 | -0.008 |
| 2019-06-20 | 2.508 | 2.501 | -0.173 | 0.128 |
| 2019-06-21 | 2.514 | 2.502 | -0.179 | 0.088 |
| 2019-06-24 | 2.513 | 2.5 | -0.163 | 0.111 |
| 2019-06-25 | 2.515 | 2.5 | -0.141 | 0.143 |
| 2019-06-26 | 2.515 | 2.5 | -0.141 | 0.143 |
| 2019-06-27 | 2.514 | 2.503 | -0.149 | 0.105 |
| 2019-06-28 | 2.515 | 2.504 | -0.15 | 0.112 |
| 2019-07-01 | 2.516 | 2.507 | -0.162 | 0.088 |
| 2019-07-02 | 2.521 | 2.523 | -0.143 | 0.087 |
| 2019-07-03 | 2.523 | 2.533 | -0.119 | 0.11 |
| 2019-07-04 | 2.524 | 2.548 | -0.133 | 0.111 |
| 2019-07-08 | 2.526 | 2.548 | -0.168 | 0.029 |
| 2019-07-09 | 2.528 | 2.538 | -0.171 | 0.007 |
| 2019-07-10 | 2.528 | 2.533 | -0.17 | -0.006 |
| 2019-07-11 | 2.534 | 2.557 | -0.133 | 0.087 |
| 2019-07-12 | 2.533 | 2.56 | -0.152 | 0.049 |
| 2019-07-15 | 2.523 | 2.567 | -0.143 | 0.07 |
| 2019-07-16 | 2.523 | 2.567 | -0.143 | 0.07 |
| 2019-07-17 | 2.529 | 2.578 | -0.143 | 0.063 |
| 2019-07-18 | 2.53 | 2.583 | -0.118 | 0.088 |
| 2019-07-19 | 2.535 | 2.588 | -0.099 | 0.122 |